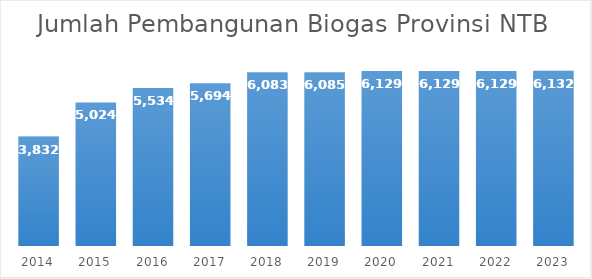
| Category |  Jumlah Pembangunan Biogas Provinsi NTB  |
|---|---|
| 2014.0 | 3832 |
| 2015.0 | 5024 |
| 2016.0 | 5534 |
| 2017.0 | 5694 |
| 2018.0 | 6083 |
| 2019.0 | 6085 |
| 2020.0 | 6129 |
| 2021.0 | 6129 |
| 2022.0 | 6129 |
| 2023.0 | 6132 |